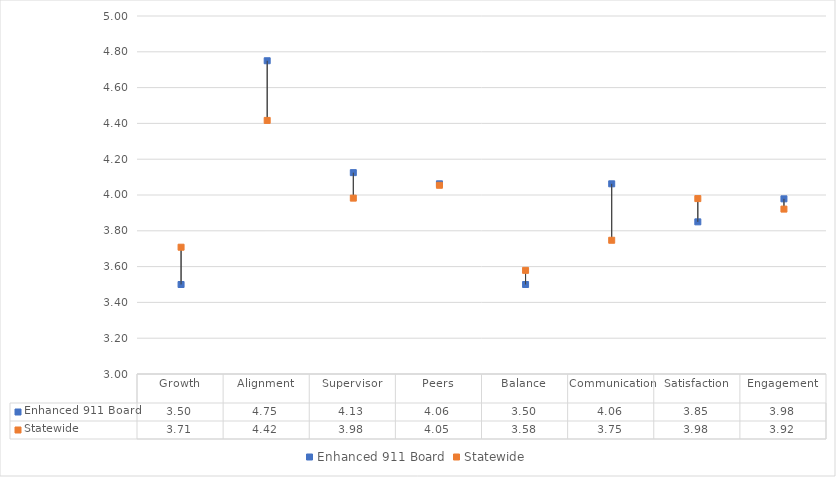
| Category | Enhanced 911 Board | Statewide |
|---|---|---|
| Growth | 3.5 | 3.708 |
| Alignment | 4.75 | 4.417 |
| Supervisor | 4.125 | 3.983 |
| Peers | 4.062 | 4.054 |
| Balance | 3.5 | 3.579 |
| Communication | 4.062 | 3.747 |
| Satisfaction | 3.85 | 3.98 |
| Engagement | 3.979 | 3.921 |